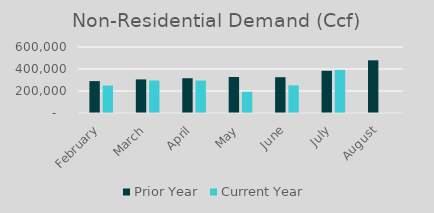
| Category | Prior Year | Current Year |
|---|---|---|
| February | 289857 | 249807 |
| March | 305426 | 295423 |
| April | 315985 | 295012.49 |
| May | 327135 | 192797 |
| June | 325420 | 250692.26 |
| July | 383814 | 392092.25 |
| August | 478930 | 0 |